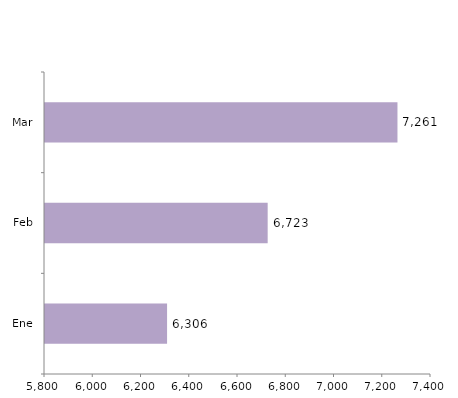
| Category | Series 0 |
|---|---|
| Ene | 6306 |
| Feb | 6723 |
| Mar | 7261 |